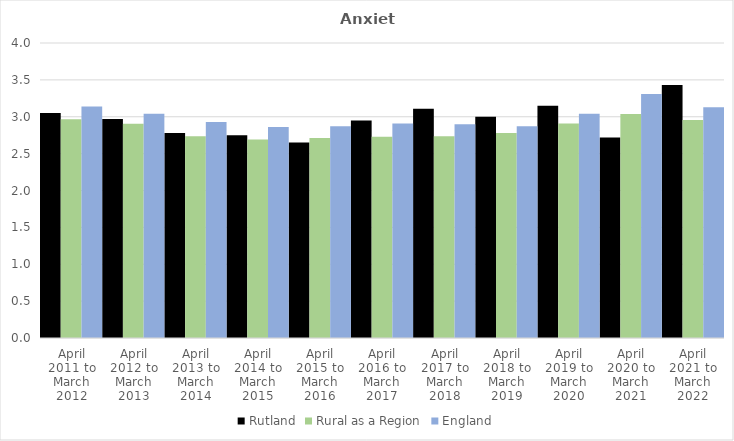
| Category | Rutland | Rural as a Region | England |
|---|---|---|---|
| April 2011 to March 2012 | 3.05 | 2.967 | 3.14 |
| April 2012 to March 2013 | 2.97 | 2.904 | 3.04 |
| April 2013 to March 2014 | 2.78 | 2.734 | 2.93 |
| April 2014 to March 2015 | 2.75 | 2.691 | 2.86 |
| April 2015 to March 2016 | 2.65 | 2.711 | 2.87 |
| April 2016 to March 2017 | 2.95 | 2.729 | 2.91 |
| April 2017 to March 2018 | 3.11 | 2.736 | 2.9 |
| April 2018 to March 2019 | 3 | 2.78 | 2.87 |
| April 2019 to March 2020 | 3.15 | 2.908 | 3.04 |
| April 2020 to March 2021 | 2.72 | 3.036 | 3.31 |
| April 2021 to March 2022 | 3.43 | 2.956 | 3.13 |